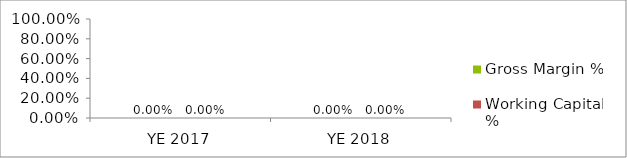
| Category | Gross Margin % | Working Capital % |
|---|---|---|
| YE 2017 | 0 | 0 |
| YE 2018 | 0 | 0 |